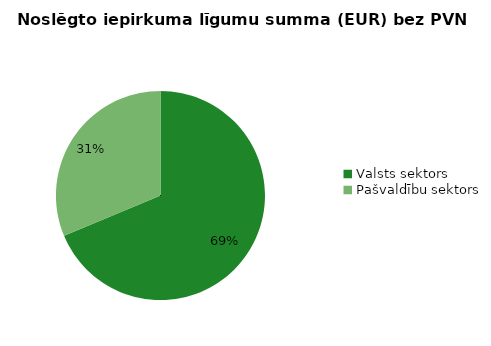
| Category | Noslēgto iepirkuma līgumu summa (EUR) bez PVN |
|---|---|
| Valsts sektors | 14410489 |
| Pašvaldību sektors | 6567220 |